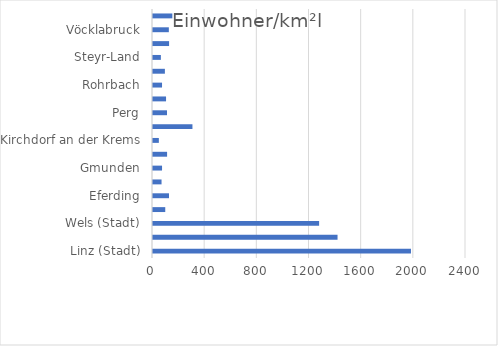
| Category | Series 0 |
|---|---|
| Linz (Stadt) | 1978.01 |
| Steyr (Stadt) | 1415 |
| Wels (Stadt) | 1273.717 |
| Braunau am Inn | 93.973 |
| Eferding | 122.552 |
| Freistadt | 65.506 |
| Gmunden | 69.367 |
| Grieskirchen | 108.04 |
| Kirchdorf an der Krems | 44.84 |
| Linz-Land | 302.426 |
| Perg | 107.24 |
| Ried im Innkreis | 100.091 |
| Rohrbach | 69.301 |
| Schärding | 91.157 |
| Steyr-Land | 60.329 |
| Urfahr-Umgebung | 123.333 |
| Vöcklabruck | 121.45 |
| Wels-Land | 148.352 |